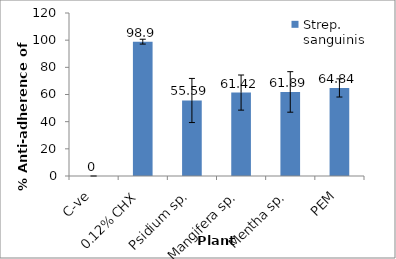
| Category | Strep. sanguinis BAA-1455 |
|---|---|
| C-ve | 0 |
| 0.12% CHX | 98.9 |
| Psidium sp. | 55.59 |
| Mangifera sp. | 61.42 |
| Mentha sp. | 61.89 |
| PEM | 64.84 |